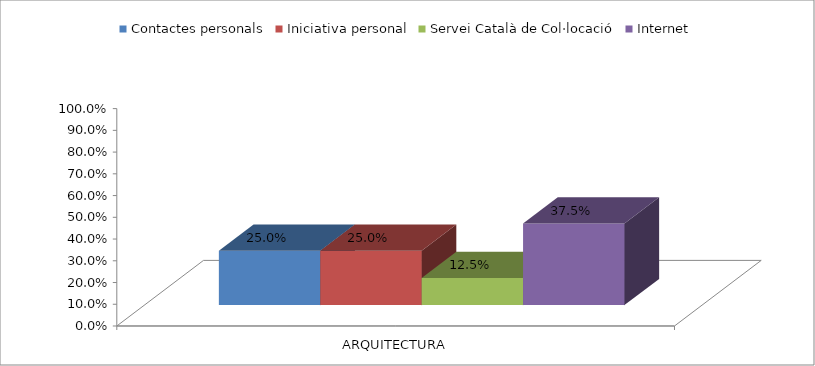
| Category | Contactes personals | Iniciativa personal | Servei Català de Col·locació | Internet |
|---|---|---|---|---|
| ARQUITECTURA | 0.25 | 0.25 | 0.125 | 0.375 |